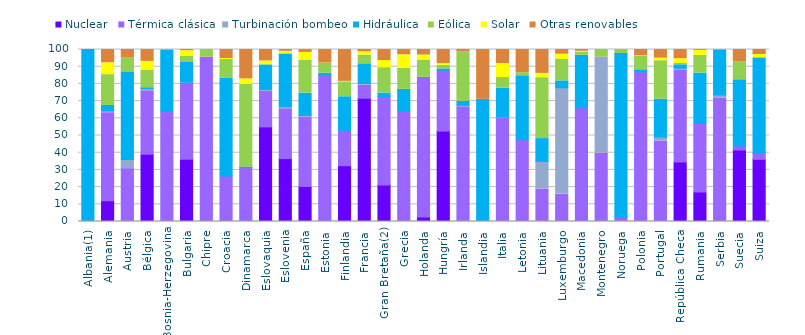
| Category | Nuclear | Térmica clásica | Turbinación bombeo | Hidráulica | Eólica | Solar | Otras renovables |
|---|---|---|---|---|---|---|---|
| Albania(1) | 0 | 0 | 0 | 100 | 0 | 0 | 0 |
| Alemania | 12.026 | 51.232 | 1.115 | 3.088 | 17.933 | 6.887 | 7.719 |
| Austria | 0 | 30.733 | 5.304 | 50.557 | 8.731 | 0 | 4.676 |
| Bélgica | 39.071 | 36.906 | 1.423 | 0.37 | 10.266 | 5.05 | 6.913 |
| Bosnia-Herzegovina | 0 | 63.314 | 0.595 | 35.495 | 0.597 | 0 | 0 |
| Bulgaria | 36.154 | 44.203 | 0.649 | 11.829 | 3.204 | 3.264 | 0.697 |
| Chipre | 0 | 95.637 | 0 | 0 | 4.363 | 0 | 0 |
| Croacia | 0 | 26.425 | 0 | 56.804 | 10.98 | 0.552 | 5.239 |
| Dinamarca | 0 | 31.561 | 0 | 0.051 | 48.014 | 3.315 | 17.059 |
| Eslovaquia | 55.018 | 20.593 | 1.159 | 14.3 | 0.022 | 2.279 | 6.629 |
| Eslovenia | 36.565 | 28.982 | 1.252 | 30.619 | 0.04 | 1.5 | 1.042 |
| España | 20.384 | 40.407 | 0.77 | 13.069 | 18.994 | 4.668 | 1.657 |
| Estonia | 0 | 85.041 | 0 | 1.173 | 5.687 | 0.167 | 7.932 |
| Finlandia | 32.445 | 20.596 | 0 | 19.484 | 8.685 | 0.24 | 18.55 |
| Francia | 71.659 | 7.582 | 0.937 | 11.51 | 5.076 | 1.862 | 1.374 |
| Gran Bretaña(2) | 21.224 | 51.337 | 0 | 2.087 | 14.798 | 4.13 | 6.425 |
| Grecia | 0 | 64.088 | 0.036 | 12.695 | 12.298 | 7.804 | 3.079 |
| Holanda | 2.589 | 81.167 | 0 | 0.075 | 10.085 | 2.871 | 3.213 |
| Hungría | 52.55 | 35.377 | 0 | 0.764 | 2.095 | 0.949 | 8.266 |
| Irlanda | 0 | 66.762 | 0.802 | 2.347 | 28.613 | 0 | 1.476 |
| Islandia | 0 | 0.009 | 0 | 70.978 | 0.023 | 0 | 28.991 |
| Italia | 0 | 59.874 | 0.848 | 16.819 | 6.161 | 8.159 | 8.138 |
| Letonia | 0 | 47.523 | 0 | 37.185 | 1.846 | 0 | 13.446 |
| Lituania | 0 | 18.802 | 16.165 | 13.249 | 35.371 | 2.513 | 13.9 |
| Luxemburgo | 0 | 15.931 | 61.834 | 3.99 | 12.462 | 3.052 | 2.732 |
| Macedonia | 0 | 66.154 | 0 | 30.489 | 1.876 | 0.439 | 1.042 |
| Montenegro | 0 | 39.621 | 55.98 | 0 | 4.399 | 0 | 0 |
| Noruega | 0 | 2.925 | 0 | 94.752 | 2.323 | 0 | 0 |
| Polonia | 0 | 86.72 | 0.265 | 1.231 | 7.931 | 0.177 | 3.677 |
| Portugal | 0 | 46.856 | 2.291 | 21.934 | 22.404 | 1.487 | 5.027 |
| República Checa | 34.524 | 53.316 | 1.305 | 1.966 | 0.734 | 2.808 | 5.347 |
| Rumania | 17.201 | 39.964 | 0 | 29.126 | 10.312 | 2.889 | 0.507 |
| Serbia | 0 | 71.606 | 1.905 | 26.276 | 0.214 | 0 | 0 |
| Suecia | 41.573 | 2.345 | 0 | 38.525 | 10.513 | 0 | 7.044 |
| Suiza | 36.14 | 3.557 | 0 | 55.409 | 0.182 | 1.8 | 2.912 |